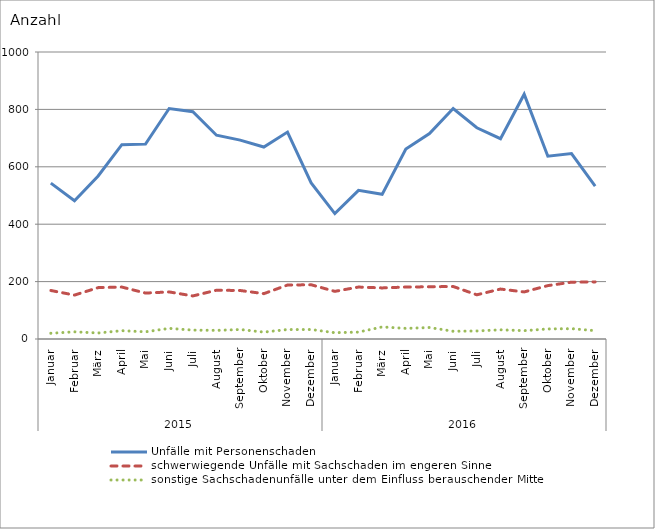
| Category | Unfälle mit Personenschaden | schwerwiegende Unfälle mit Sachschaden im engeren Sinne | sonstige Sachschadenunfälle unter dem Einfluss berauschender Mittel |
|---|---|---|---|
| 0 | 543 | 169 | 20 |
| 1 | 482 | 153 | 25 |
| 2 | 568 | 179 | 21 |
| 3 | 677 | 181 | 29 |
| 4 | 679 | 160 | 25 |
| 5 | 803 | 164 | 37 |
| 6 | 792 | 150 | 31 |
| 7 | 710 | 170 | 30 |
| 8 | 693 | 169 | 33 |
| 9 | 669 | 158 | 24 |
| 10 | 721 | 188 | 33 |
| 11 | 544 | 189 | 33 |
| 12 | 437 | 166 | 22 |
| 13 | 518 | 181 | 24 |
| 14 | 504 | 178 | 42 |
| 15 | 662 | 181 | 37 |
| 16 | 716 | 182 | 40 |
| 17 | 803 | 183 | 27 |
| 18 | 736 | 154 | 28 |
| 19 | 698 | 174 | 32 |
| 20 | 853 | 164 | 29 |
| 21 | 637 | 186 | 35 |
| 22 | 646 | 198 | 36 |
| 23 | 533 | 199 | 29 |